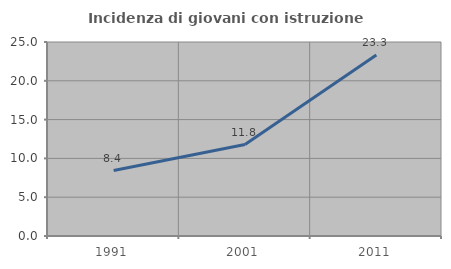
| Category | Incidenza di giovani con istruzione universitaria |
|---|---|
| 1991.0 | 8.437 |
| 2001.0 | 11.787 |
| 2011.0 | 23.326 |